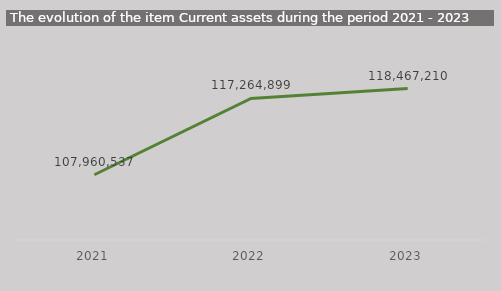
| Category | Series 0 |
|---|---|
| 2021.0 | 107960537 |
| 2022.0 | 117264899 |
| 2023.0 | 118467210 |